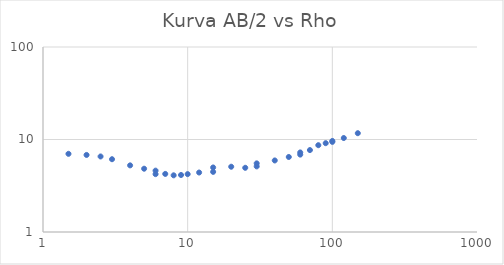
| Category | Series 0 |
|---|---|
| 1.5 | 7.001 |
| 2.0 | 6.809 |
| 2.5 | 6.554 |
| 3.0 | 6.122 |
| 4.0 | 5.252 |
| 5.0 | 4.832 |
| 6.0 | 4.606 |
| 6.0 | 4.223 |
| 7.0 | 4.246 |
| 8.0 | 4.1 |
| 9.0 | 4.133 |
| 10.0 | 4.224 |
| 12.0 | 4.395 |
| 15.0 | 4.467 |
| 15.0 | 4.984 |
| 20.0 | 5.077 |
| 25.0 | 4.944 |
| 30.0 | 5.121 |
| 30.0 | 5.52 |
| 40.0 | 5.935 |
| 50.0 | 6.472 |
| 60.0 | 6.864 |
| 60.0 | 7.246 |
| 70.0 | 7.687 |
| 80.0 | 8.679 |
| 90.0 | 9.123 |
| 100.0 | 9.647 |
| 100.0 | 9.424 |
| 120.0 | 10.374 |
| 150.0 | 11.699 |